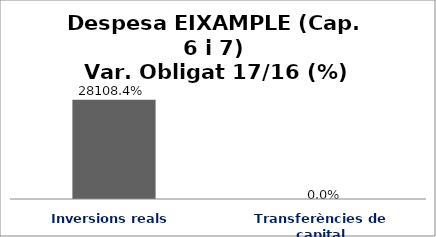
| Category | Series 0 |
|---|---|
| Inversions reals | 281.084 |
| Transferències de capital | 0 |